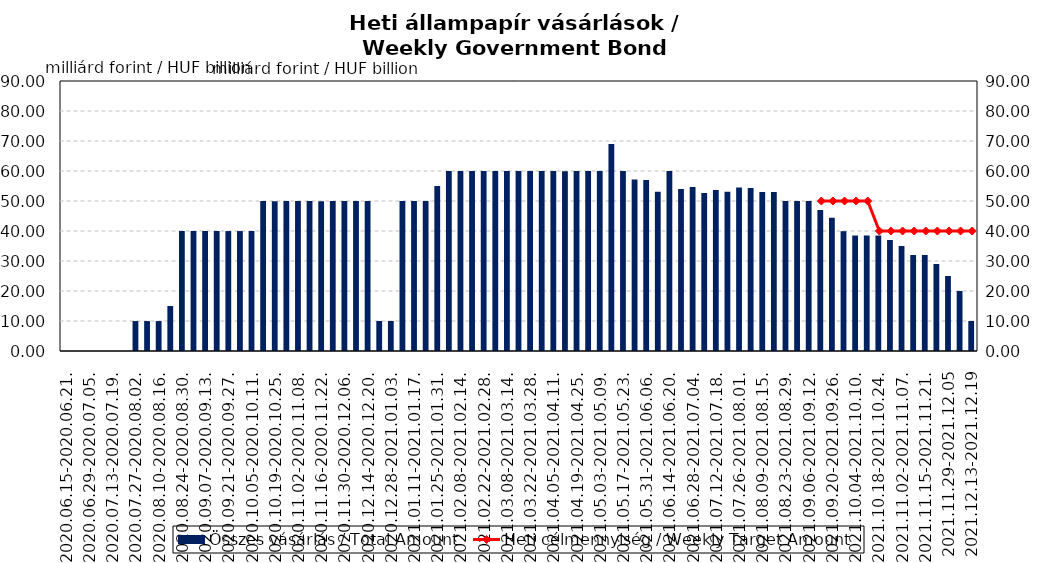
| Category | Összes vásárlás / Total Amount |
|---|---|
| 2020.06.15-2020.06.21. | 0 |
| 2020.06.22-2020.06.28. | 0 |
| 2020.06.29-2020.07.05. | 0 |
| 2020.07.06-2020.07.12. | 0 |
| 2020.07.13-2020.07.19. | 0 |
| 2020.07.20-2020.07.26. | 0 |
| 2020.07.27-2020.08.02. | 9.98 |
| 2020.08.03-2020.08.09. | 9.98 |
| 2020.08.10-2020.08.16. | 9.98 |
| 2020.08.17-2020.08.23. | 14.99 |
| 2020.08.24-2020.08.30. | 40 |
| 2020.08.31-2020.09.06. | 40 |
| 2020.09.07-2020.09.13. | 40 |
| 2020.09.14-2020.09.20. | 40 |
| 2020.09.21-2020.09.27. | 39.98 |
| 2020.09.28-2020.10.04. | 39.98 |
| 2020.10.05-2020.10.11. | 40 |
| 2020.10.12-2020.10.18. | 49.98 |
| 2020.10.19-2020.10.25. | 49.95 |
| 2020.10.26-2020.11.01. | 50 |
| 2020.11.02-2020.11.08. | 50 |
| 2020.11.09-2020.11.15. | 49.98 |
| 2020.11.16-2020.11.22. | 49.95 |
| 2020.11.23-2020.11.29. | 50 |
| 2020.11.30-2020.12.06. | 50 |
| 2020.12.07-2020.12.13. | 49.98 |
| 2020.12.14-2020.12.20. | 50 |
| 2020.12.21-2020.12.27. | 10 |
| 2020.12.28-2021.01.03. | 10 |
| 2021.01.04-2021.01.10. | 50 |
| 2021.01.11-2021.01.17. | 50 |
| 2021.01.18-2021.01.24. | 49.99 |
| 2021.01.25-2021.01.31. | 55 |
| 2021.02.01-2021.02.07. | 60 |
| 2021.02.08-2021.02.14. | 59.98 |
| 2021.02.15-2021.02.21. | 59.99 |
| 2021.02.22-2021.02.28. | 59.98 |
| 2021.03.01-2021.03.07. | 60 |
| 2021.03.08-2021.03.14. | 60 |
| 2021.03.15-2021.03.21. | 60 |
| 2021.03.22-2021.03.28. | 60 |
| 2021.03.29-2021.04.04. | 59.99 |
| 2021.04.05-2021.04.11. | 59.99 |
| 2021.04.12-2021.04.18. | 59.94 |
| 2021.04.19-2021.04.25. | 60 |
| 2021.04.26-2021.05.02. | 59.98 |
| 2021.05.03-2021.05.09. | 60 |
| 2021.05.10-2021.05.16. | 69 |
| 2021.05.17-2021.05.23. | 60 |
| 2021.05.24-2021.05.30. | 57.18 |
| 2021.05.31-2021.06.06. | 56.98 |
| 2021.06.07-2021.06.13. | 53.08 |
| 2021.06.14-2021.06.20. | 59.99 |
| 2021.06.21-2021.06.27. | 54 |
| 2021.06.28-2021.07.04. | 54.7 |
| 2021.07.05-2021.07.11. | 52.68 |
| 2021.07.12-2021.07.18. | 53.627 |
| 2021.07.19-2021.07.25. | 53.1 |
| 2021.07.26-2021.08.01. | 54.48 |
| 2021.08.02-2021.08.08. | 54.33 |
| 2021.08.09-2021.08.15. | 53 |
| 2021.08.16-2021.08.22. | 53 |
| 2021.08.23-2021.08.29. | 50 |
| 2021.08.30-2021.09.05. | 50 |
| 2021.09.06-2021.09.12. | 50 |
| 2021.09.13-2021.09.19. | 46.96 |
| 2021.09.20-2021.09.26. | 44.38 |
| 2021.09.27-2021.10.03. | 39.94 |
| 2021.10.04-2021.10.10. | 38.49 |
| 2021.10.11-2021.10.17. | 38.5 |
| 2021.10.18-2021.10.24. | 38.5 |
| 2021.10.25-2021.10.31. | 37 |
| 2021.11.02-2021.11.07. | 35 |
| 2021.11.08-2021.11.14. | 32 |
| 2021.11.15-2021.11.21. | 32 |
| 2021.11.22-2021.11.28 | 29 |
| 2021.11.29-2021.12.05 | 25 |
| 2021.12.06-2021.12.12 | 20 |
| 2021.12.13-2021.12.19 | 10 |